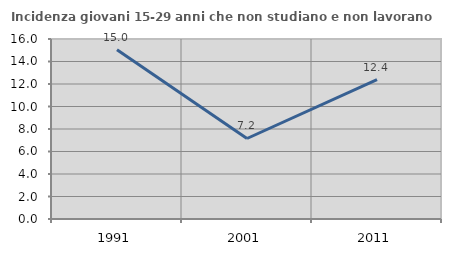
| Category | Incidenza giovani 15-29 anni che non studiano e non lavorano  |
|---|---|
| 1991.0 | 15.041 |
| 2001.0 | 7.156 |
| 2011.0 | 12.389 |